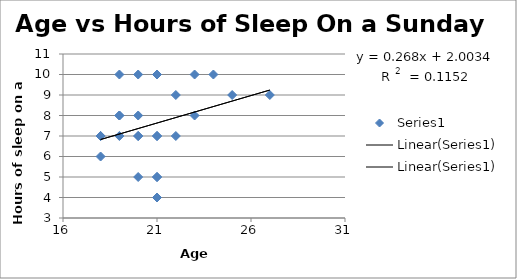
| Category | Series 0 |
|---|---|
| 21.0 | 4 |
| 19.0 | 10 |
| 22.0 | 7 |
| 21.0 | 10 |
| 18.0 | 7 |
| 20.0 | 5 |
| 20.0 | 7 |
| 21.0 | 7 |
| 25.0 | 9 |
| 21.0 | 5 |
| 24.0 | 10 |
| 19.0 | 7 |
| 18.0 | 6 |
| 27.0 | 9 |
| 20.0 | 10 |
| 19.0 | 8 |
| 21.0 | 7 |
| 22.0 | 9 |
| 23.0 | 8 |
| 23.0 | 10 |
| 21.0 | 5 |
| 20.0 | 8 |
| 18.0 | 7 |
| 19.0 | 8 |
| 20.0 | 7 |